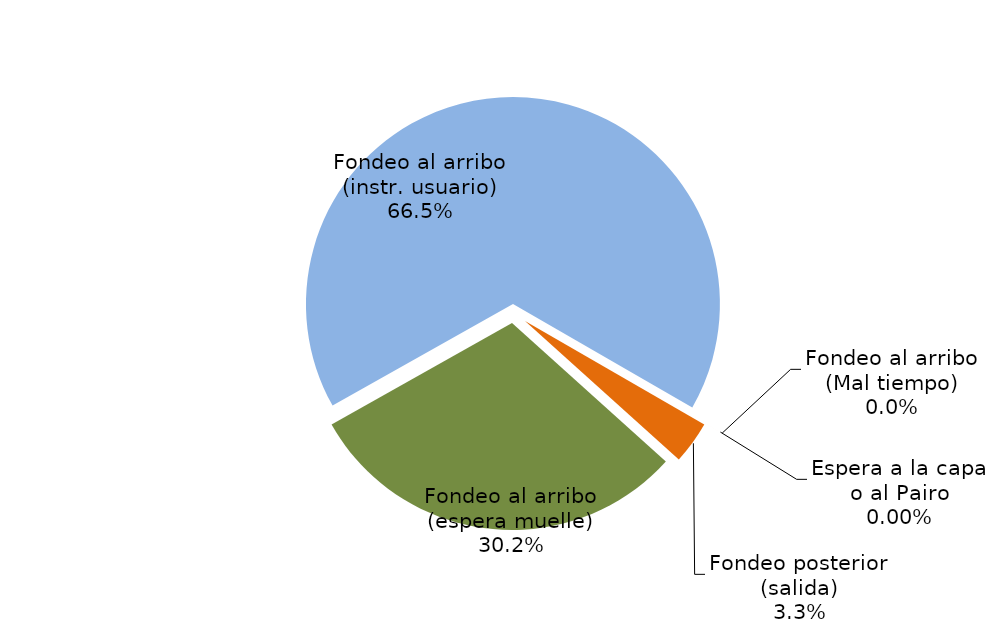
| Category | Series 0 |
|---|---|
| Fondeo al arribo (espera muelle) | 3120.798 |
| Fondeo al arribo (instr. usuario) | 6875.05 |
| Fondeo al arribo (Mal tiempo) | 0 |
| Espera a la capa o al Pairo | 0 |
| Fondeo posterior (salida) | 345.227 |